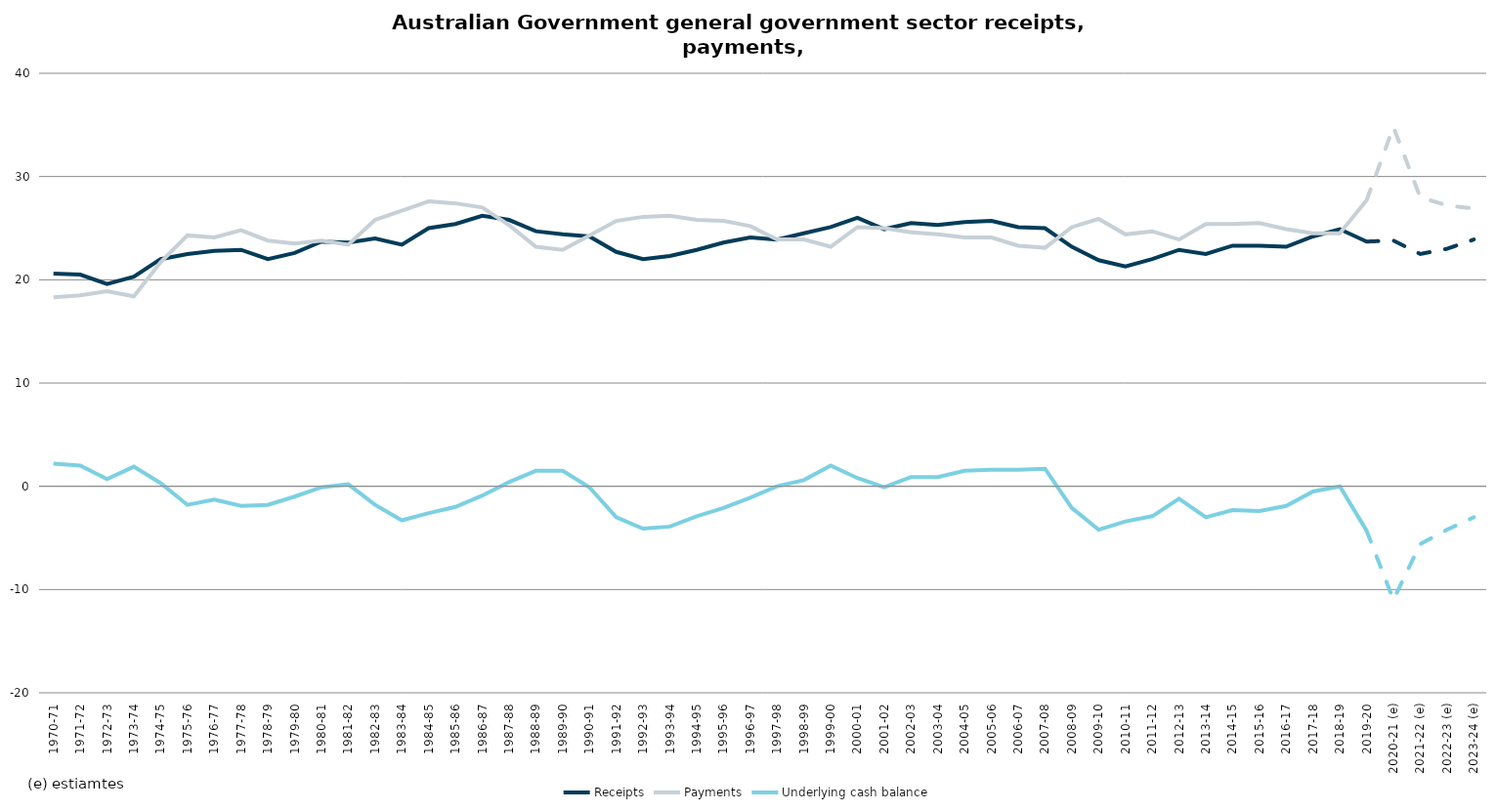
| Category | Receipts | Payments | Underlying cash balance |
|---|---|---|---|
| 1970-71 | 20.6 | 18.3 | 2.2 |
| 1971-72 | 20.5 | 18.5 | 2 |
| 1972-73 | 19.6 | 18.9 | 0.7 |
| 1973-74 | 20.3 | 18.4 | 1.9 |
| 1974-75 | 22 | 21.7 | 0.3 |
| 1975-76 | 22.5 | 24.3 | -1.8 |
| 1976-77 | 22.8 | 24.1 | -1.3 |
| 1977-78 | 22.9 | 24.8 | -1.9 |
| 1978-79 | 22 | 23.8 | -1.8 |
| 1979-80 | 22.6 | 23.5 | -1 |
| 1980-81 | 23.7 | 23.8 | -0.1 |
| 1981-82 | 23.6 | 23.4 | 0.2 |
| 1982-83 | 24 | 25.8 | -1.8 |
| 1983-84 | 23.4 | 26.7 | -3.3 |
| 1984-85 | 25 | 27.6 | -2.6 |
| 1985-86 | 25.4 | 27.4 | -2 |
| 1986-87 | 26.2 | 27 | -0.9 |
| 1987-88 | 25.8 | 25.3 | 0.4 |
| 1988-89 | 24.7 | 23.2 | 1.5 |
| 1989-90 | 24.4 | 22.9 | 1.5 |
| 1990-91 | 24.2 | 24.3 | -0.1 |
| 1991-92 | 22.7 | 25.7 | -3 |
| 1992-93 | 22 | 26.1 | -4.1 |
| 1993-94 | 22.3 | 26.2 | -3.9 |
| 1994-95 | 22.9 | 25.8 | -2.9 |
| 1995-96 | 23.6 | 25.7 | -2.1 |
| 1996-97 | 24.1 | 25.2 | -1.1 |
| 1997-98 | 23.9 | 23.9 | 0 |
| 1998-99 | 24.5 | 23.9 | 0.6 |
| 1999-00 | 25.1 | 23.2 | 2 |
| 2000-01 | 26 | 25.1 | 0.8 |
| 2001-02 | 24.9 | 25 | -0.1 |
| 2002-03 | 25.5 | 24.6 | 0.9 |
| 2003-04 | 25.3 | 24.4 | 0.9 |
| 2004-05 | 25.6 | 24.1 | 1.5 |
| 2005-06 | 25.7 | 24.1 | 1.6 |
| 2006-07 | 25.1 | 23.3 | 1.6 |
| 2007-08 | 25 | 23.1 | 1.7 |
| 2008-09 | 23.2 | 25.1 | -2.1 |
| 2009-10 | 21.9 | 25.9 | -4.2 |
| 2010-11 | 21.3 | 24.4 | -3.4 |
| 2011-12 | 22 | 24.7 | -2.9 |
| 2012-13 | 22.9 | 23.9 | -1.2 |
| 2013-14 | 22.5 | 25.4 | -3 |
| 2014-15 | 23.3 | 25.4 | -2.3 |
| 2015-16 | 23.3 | 25.5 | -2.4 |
| 2016-17 | 23.2 | 24.9 | -1.9 |
| 2017-18 | 24.2 | 24.5 | -0.5 |
| 2018-19 | 24.9 | 24.5 | 0 |
| 2019-20 | 23.7 | 27.7 | -4.3 |
| 2020-21 (e) | 23.8 | 34.8 | -11 |
| 2021-22 (e) | 22.5 | 28 | -5.6 |
| 2022-23 (e) | 23 | 27.2 | -4.2 |
| 2023-24 (e) | 23.9 | 26.9 | -3 |